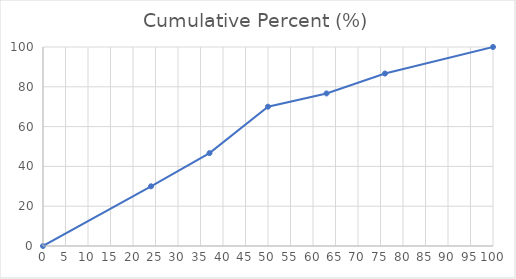
| Category | Cumulative Percent (%) |
|---|---|
| 0.0 | 0 |
| 24.0 | 30 |
| 37.0 | 46.667 |
| 50.0 | 70 |
| 63.0 | 76.667 |
| 76.0 | 86.667 |
| 100.0 | 100 |